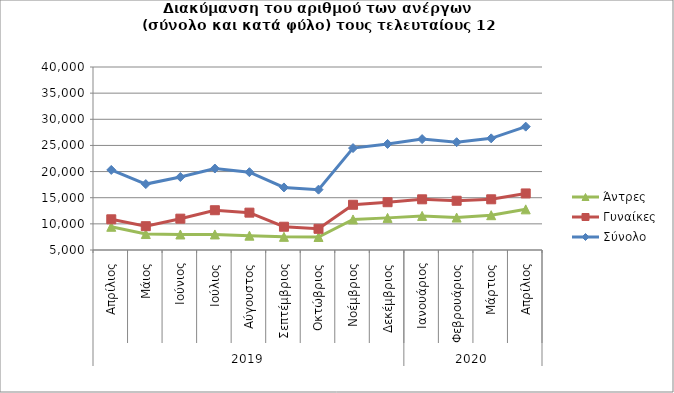
| Category | Άντρες | Γυναίκες | Σύνολο |
|---|---|---|---|
| 0 | 9443 | 10872 | 20315 |
| 1 | 8053 | 9554 | 17607 |
| 2 | 7968 | 10992 | 18960 |
| 3 | 7975 | 12607 | 20582 |
| 4 | 7739 | 12144 | 19883 |
| 5 | 7518 | 9450 | 16968 |
| 6 | 7491 | 9053 | 16544 |
| 7 | 10842 | 13653 | 24495 |
| 8 | 11144 | 14141 | 25285 |
| 9 | 11522 | 14692 | 26214 |
| 10 | 11203 | 14417 | 25620 |
| 11 | 11658 | 14695 | 26353 |
| 12 | 12774 | 15817 | 28591 |